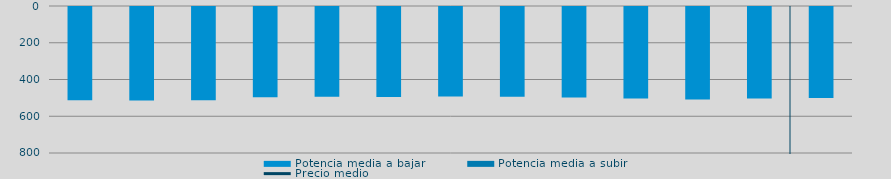
| Category | Potencia media a bajar | Potencia media a subir |
|---|---|---|
| 0 | 508.149 |  |
| 1 | 509.307 |  |
| 2 | 507.622 |  |
| 3 | 491.087 |  |
| 4 | 488.923 |  |
| 5 | 489.119 |  |
| 6 | 487.546 |  |
| 7 | 488.653 |  |
| 8 | 492.01 |  |
| 9 | 498.529 |  |
| 10 | 503.264 |  |
| 11 | 498.488 |  |
| 12 | 495.172 |  |